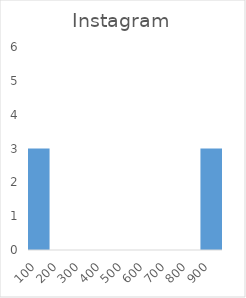
| Category | Series 0 |
|---|---|
| 100.0 | 3 |
| 200.0 | 0 |
| 300.0 | 0 |
| 400.0 | 0 |
| 500.0 | 0 |
| 600.0 | 0 |
| 700.0 | 0 |
| 800.0 | 0 |
| 900.0 | 3 |